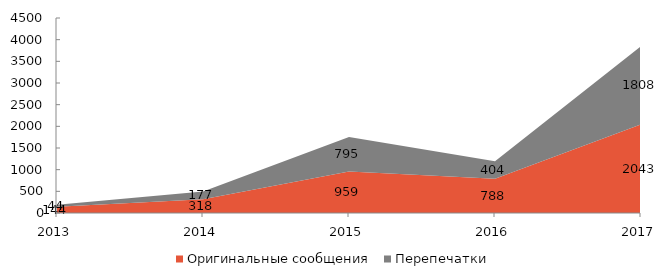
| Category | Оригинальные сообщения | Перепечатки |
|---|---|---|
| 2013 | 144 | 44 |
| 2014 | 318 | 177 |
| 2015 | 959 | 795 |
| 2016 | 788 | 404 |
| 2017 | 2043 | 1808 |